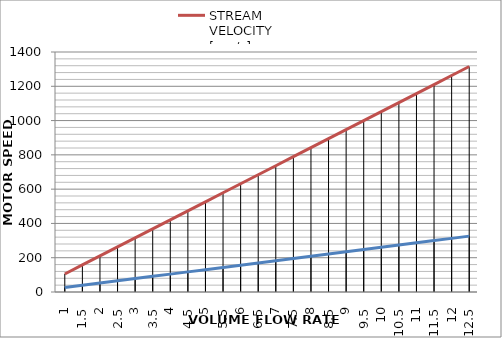
| Category | STREAM VELOCITY [µm/s] | MOTOR SPEED [RPM] |
|---|---|---|
| 1.0 | 105.226 | 26.073 |
| 1.5 | 157.84 | 39.109 |
| 2.0 | 210.453 | 52.146 |
| 2.5 | 263.066 | 65.182 |
| 3.0 | 315.679 | 78.219 |
| 3.5 | 368.292 | 91.255 |
| 4.0 | 420.906 | 104.291 |
| 4.5 | 473.519 | 117.328 |
| 5.0 | 526.132 | 130.364 |
| 5.5 | 578.745 | 143.401 |
| 6.0 | 631.358 | 156.437 |
| 6.5 | 683.972 | 169.474 |
| 7.0 | 736.585 | 182.51 |
| 7.5 | 789.198 | 195.546 |
| 8.0 | 841.811 | 208.583 |
| 8.5 | 894.424 | 221.619 |
| 9.0 | 947.038 | 234.656 |
| 9.5 | 999.651 | 247.692 |
| 10.0 | 1052.264 | 260.729 |
| 10.5 | 1104.877 | 273.765 |
| 11.0 | 1157.49 | 286.801 |
| 11.5 | 1210.104 | 299.838 |
| 12.0 | 1262.717 | 312.874 |
| 12.5 | 1315.33 | 325.911 |